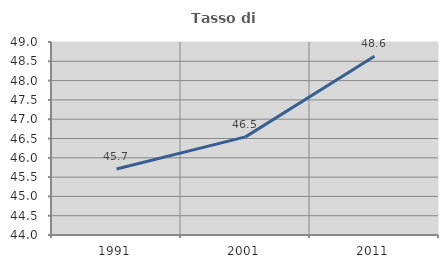
| Category | Tasso di occupazione   |
|---|---|
| 1991.0 | 45.71 |
| 2001.0 | 46.542 |
| 2011.0 | 48.632 |